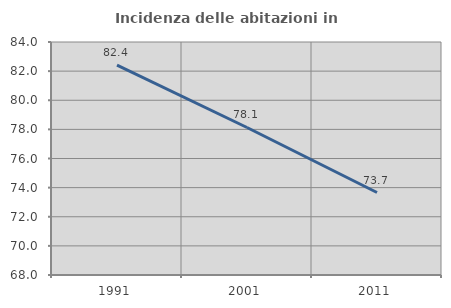
| Category | Incidenza delle abitazioni in proprietà  |
|---|---|
| 1991.0 | 82.408 |
| 2001.0 | 78.129 |
| 2011.0 | 73.664 |